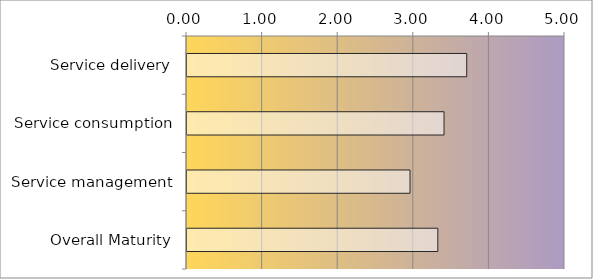
| Category | Series 0 |
|---|---|
| Service delivery | 3.7 |
| Service consumption | 3.4 |
| Service management | 2.95 |
| Overall Maturity | 3.318 |